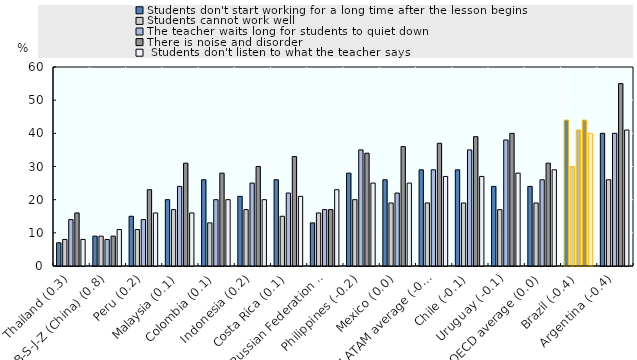
| Category | Students don't start working for a long time after the lesson begins | Students cannot work well | The teacher waits long for students to quiet down | There is noise and disorder |  Students don't listen to what the teacher says |
|---|---|---|---|---|---|
| Thailand (0.3) | 7 | 8 | 14 | 16 | 8 |
| B-S-J-Z (China) (0.8) | 9 | 9 | 8 | 9 | 11 |
| Peru (0.2) | 15 | 11 | 14 | 23 | 16 |
| Malaysia (0.1) | 20 | 17 | 24 | 31 | 16 |
| Colombia (0.1) | 26 | 13 | 20 | 28 | 20 |
| Indonesia (0.2) | 21 | 17 | 25 | 30 | 20 |
| Costa Rica (0.1) | 26 | 15 | 22 | 33 | 21 |
| Russian Federation (0.5) | 13 | 16 | 17 | 17 | 23 |
| Philippines (-0.2) | 28 | 20 | 35 | 34 | 25 |
| Mexico (0.0) | 26 | 19 | 22 | 36 | 25 |
| LATAM average (-0.1) | 29 | 19 | 29 | 37 | 27 |
| Chile (-0.1) | 29 | 19 | 35 | 39 | 27 |
| Uruguay (-0.1) | 24 | 17 | 38 | 40 | 28 |
| OECD average (0.0) | 24 | 19 | 26 | 31 | 29 |
| Brazil (-0.4) | 44 | 30 | 41 | 44 | 40 |
| Argentina (-0.4) | 40 | 26 | 40 | 55 | 41 |